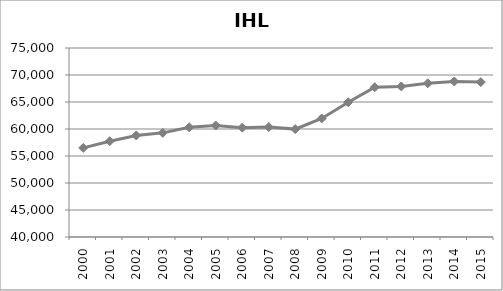
| Category | Series 0 |
|---|---|
| 2000.0 | 56497.583 |
| 2001.0 | 57737.85 |
| 2002.0 | 58803.067 |
| 2003.0 | 59285.492 |
| 2004.0 | 60315 |
| 2005.0 | 60645 |
| 2006.0 | 60249 |
| 2007.0 | 60362.575 |
| 2008.0 | 59980.292 |
| 2009.0 | 61955.629 |
| 2010.0 | 64948.304 |
| 2011.0 | 67735.275 |
| 2012.0 | 67881.925 |
| 2013.0 | 68469.292 |
| 2014.0 | 68799.554 |
| 2015.0 | 68685.312 |